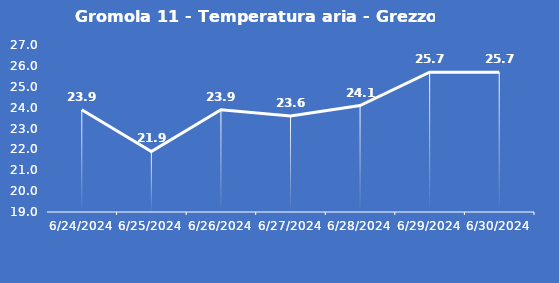
| Category | Gromola 11 - Temperatura aria - Grezzo (°C) |
|---|---|
| 6/24/24 | 23.9 |
| 6/25/24 | 21.9 |
| 6/26/24 | 23.9 |
| 6/27/24 | 23.6 |
| 6/28/24 | 24.1 |
| 6/29/24 | 25.7 |
| 6/30/24 | 25.7 |